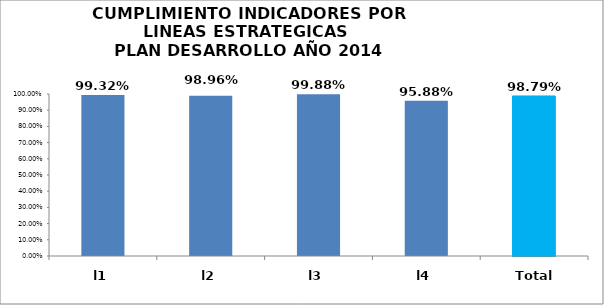
| Category | CUMPLIMIENTO |
|---|---|
| l1 | 0.993 |
| l2 | 0.99 |
| l3 | 0.999 |
| l4 | 0.959 |
| Total | 0.988 |